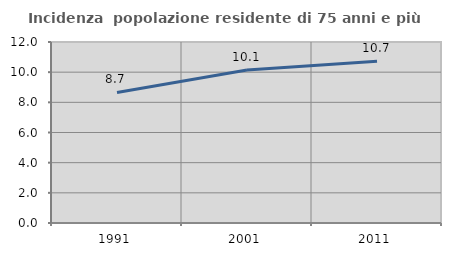
| Category | Incidenza  popolazione residente di 75 anni e più |
|---|---|
| 1991.0 | 8.655 |
| 2001.0 | 10.139 |
| 2011.0 | 10.727 |